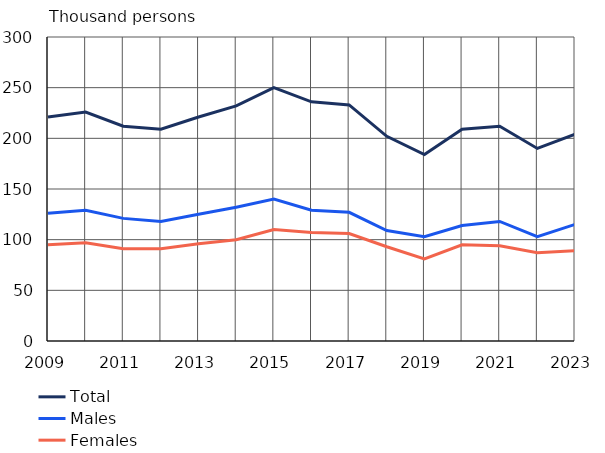
| Category | Total | Males | Females |
|---|---|---|---|
| 2009 | 221 | 126 | 95 |
| 2010 | 226 | 129 | 97 |
| 2011 | 212 | 121 | 91 |
| 2012 | 209 | 118 | 91 |
| 2013 | 221 | 125 | 96 |
| 2014 | 232 | 132 | 100 |
| 2015 | 250 | 140 | 110 |
| 2016 | 236 | 129 | 107 |
| 2017 | 233 | 127 | 106 |
| 2018 | 202 | 109 | 93 |
| 2019 | 184 | 103 | 81 |
| 2020 | 209 | 114 | 95 |
| 2021 | 212 | 118 | 94 |
| 2022 | 190 | 103 | 87 |
| 2023 | 204 | 115 | 89 |